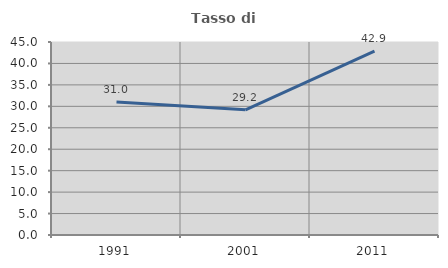
| Category | Tasso di occupazione   |
|---|---|
| 1991.0 | 31.019 |
| 2001.0 | 29.201 |
| 2011.0 | 42.857 |